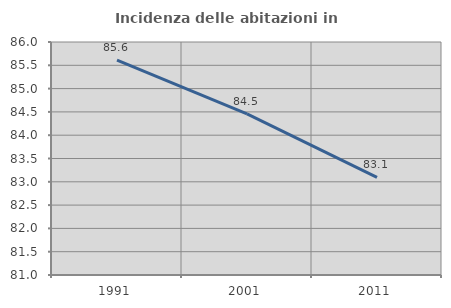
| Category | Incidenza delle abitazioni in proprietà  |
|---|---|
| 1991.0 | 85.612 |
| 2001.0 | 84.457 |
| 2011.0 | 83.095 |